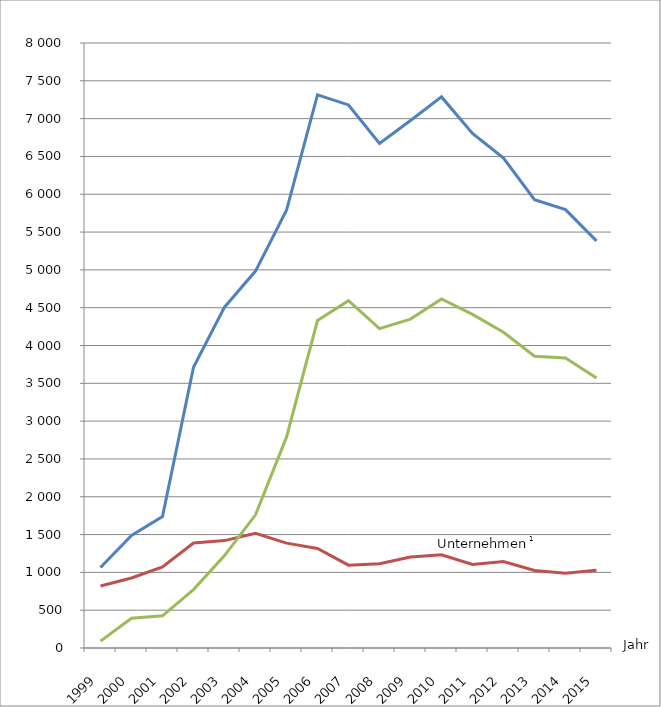
| Category | Verfahren
Insgesamt | von Unternehmen1 | von Verbrauchern |
|---|---|---|---|
| 1999.0 | 1064 | 820 | 91 |
| 2000.0 | 1488 | 926 | 394 |
| 2001.0 | 1737 | 1072 | 425 |
| 2002.0 | 3712 | 1388 | 772 |
| 2003.0 | 4507 | 1420 | 1222 |
| 2004.0 | 4984 | 1516 | 1761 |
| 2005.0 | 5788 | 1387 | 2788 |
| 2006.0 | 7315 | 1317 | 4330 |
| 2007.0 | 7181 | 1095 | 4592 |
| 2008.0 | 6671 | 1114 | 4223 |
| 2009.0 | 6976 | 1203 | 4349 |
| 2010.0 | 7287 | 1233 | 4615 |
| 2011.0 | 6803 | 1104 | 4412 |
| 2012.0 | 6477 | 1143 | 4175 |
| 2013.0 | 5928 | 1026 | 3858 |
| 2014.0 | 5796 | 987 | 3835 |
| 2015.0 | 5384 | 1027 | 3569 |